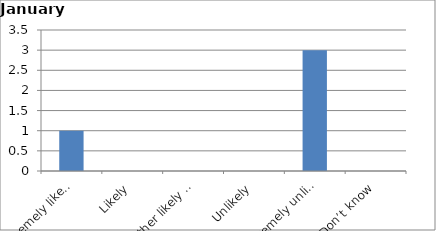
| Category | Series 0 |
|---|---|
| Extremely likely | 1 |
| Likely | 0 |
| Neither likely nor unlikely | 0 |
| Unlikely | 0 |
| Extremely unlikely | 3 |
| Don’t know | 0 |